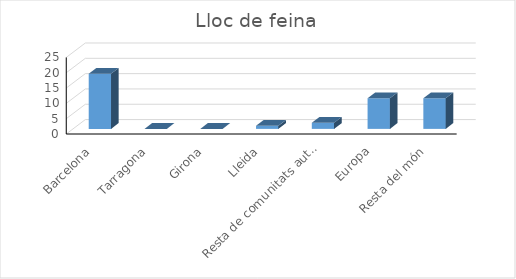
| Category | Series 0 |
|---|---|
| Barcelona | 18 |
| Tarragona | 0 |
| Girona | 0 |
| Lleida | 1 |
| Resta de comunitats autònomes | 2 |
| Europa | 10 |
| Resta del món | 10 |